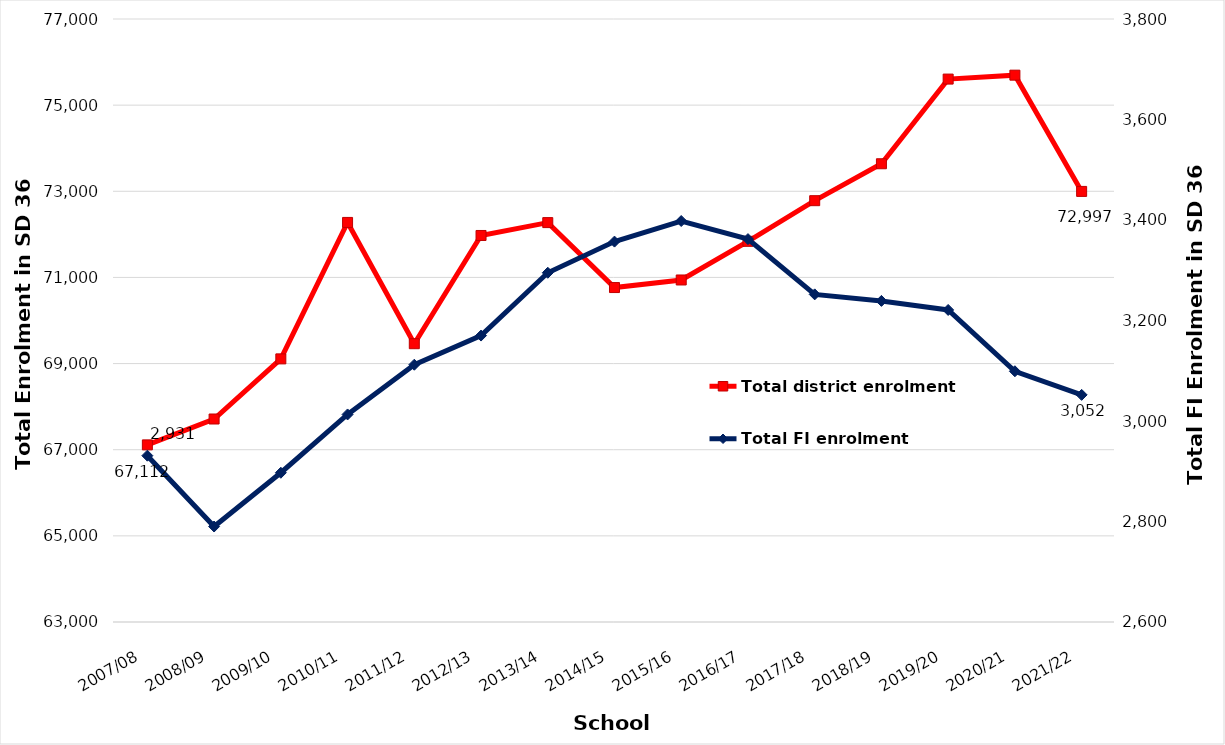
| Category | Total district enrolment  |
|---|---|
| 2007/08 | 67112 |
| 2008/09 | 67713 |
| 2009/10 | 69109 |
| 2010/11 | 72277 |
| 2011/12 | 69461 |
| 2012/13 | 71974 |
| 2013/14 | 72273 |
| 2014/15 | 70765 |
| 2015/16 | 70941 |
| 2016/17 | 71838 |
| 2017/18 | 72782 |
| 2018/19 | 73639 |
| 2019/20 | 75605 |
| 2020/21 | 75696 |
| 2021/22 | 72997 |